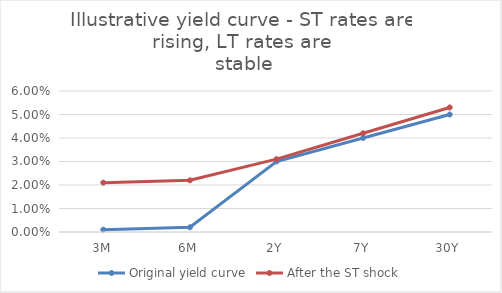
| Category | Original yield curve | After the ST shock |
|---|---|---|
| 3M | 0.001 | 0.021 |
| 6M | 0.002 | 0.022 |
| 2Y | 0.03 | 0.031 |
| 7Y | 0.04 | 0.042 |
| 30Y | 0.05 | 0.053 |